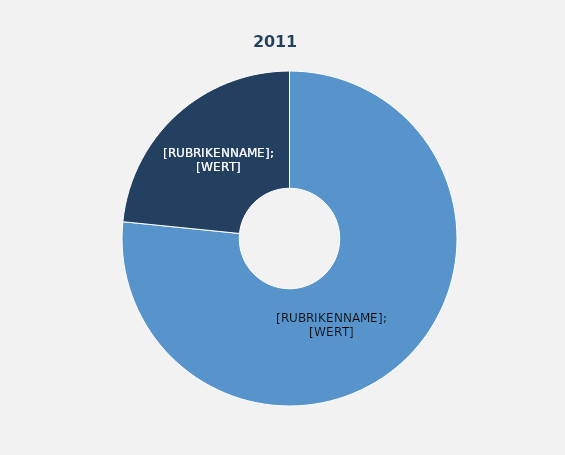
| Category | Series 1 |
|---|---|
| Vollzeitbeschäftigte | 76.6 |
| Teilzeitbeschäftigte | 23.4 |